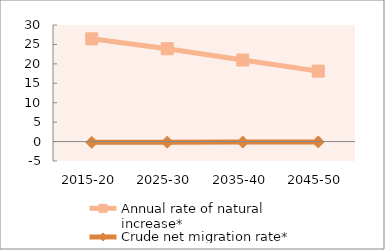
| Category | Annual rate of natural increase* | Crude net migration rate* |
|---|---|---|
| 2015-20 | 26.44 | -0.197 |
| 2025-30 | 23.898 | -0.153 |
| 2035-40 | 20.987 | -0.123 |
| 2045-50 | 18.126 | -0.101 |